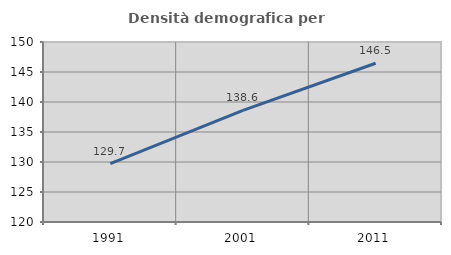
| Category | Densità demografica |
|---|---|
| 1991.0 | 129.745 |
| 2001.0 | 138.596 |
| 2011.0 | 146.465 |